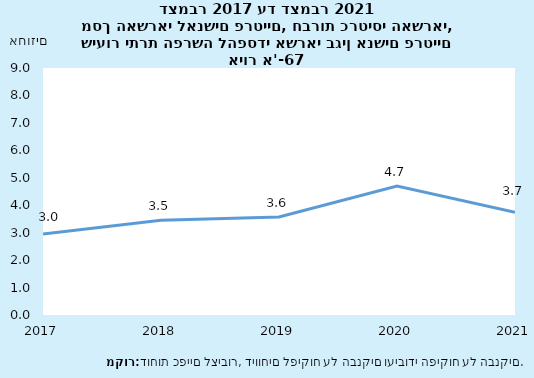
| Category | Series 0 |
|---|---|
| 2017-12-31 | 2.955 |
| 2018-12-31 | 3.453 |
| 2019-12-31 | 3.573 |
| 2020-12-31 | 4.7 |
| 2021-12-31 | 3.741 |